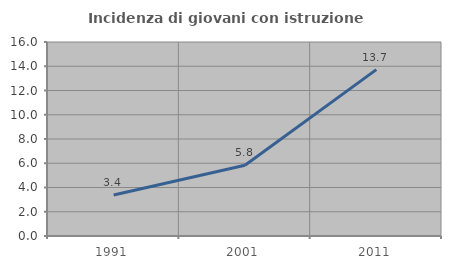
| Category | Incidenza di giovani con istruzione universitaria |
|---|---|
| 1991.0 | 3.385 |
| 2001.0 | 5.83 |
| 2011.0 | 13.719 |